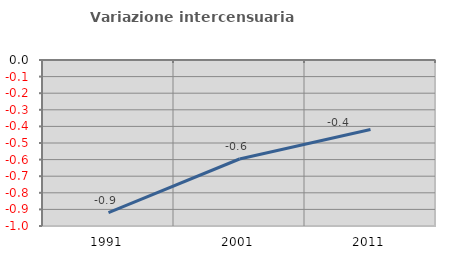
| Category | Variazione intercensuaria annua |
|---|---|
| 1991.0 | -0.919 |
| 2001.0 | -0.596 |
| 2011.0 | -0.419 |